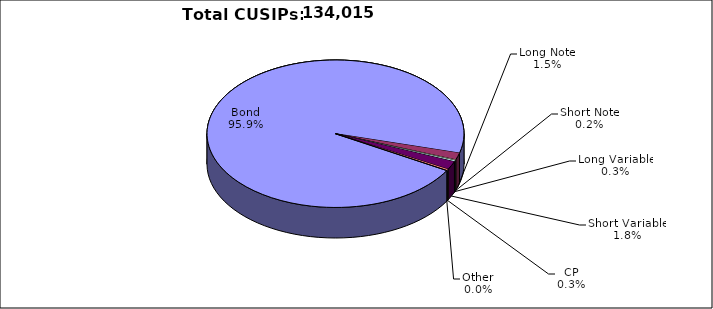
| Category | CUSIPs |
|---|---|
| Bond | 128512 |
| Long Note | 2044 |
| Short Note | 217 |
| Long Variable | 365 |
| Short Variable | 2418 |
| CP | 430 |
| Other | 29 |